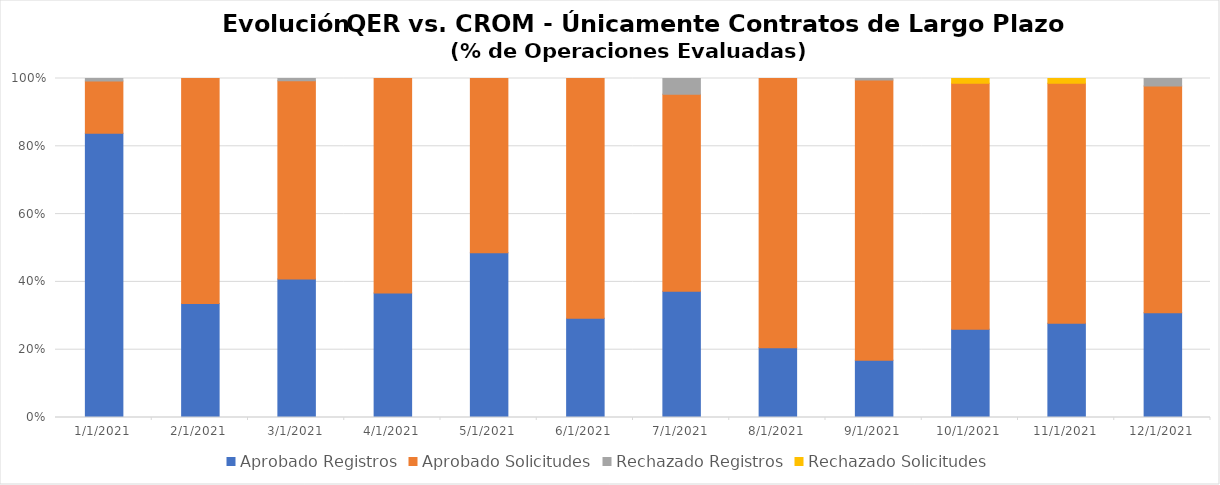
| Category | Aprobado Registros | Aprobado Solicitudes | Rechazado Registros | Rechazado Solicitudes |
|---|---|---|---|---|
| 1/1/21 | 0.838 | 0.154 | 0.008 | 0 |
| 2/1/21 | 0.337 | 0.663 | 0 | 0 |
| 3/1/21 | 0.409 | 0.585 | 0.006 | 0 |
| 4/1/21 | 0.367 | 0.633 | 0 | 0 |
| 5/1/21 | 0.486 | 0.514 | 0 | 0 |
| 6/1/21 | 0.293 | 0.707 | 0 | 0 |
| 7/1/21 | 0.372 | 0.581 | 0.047 | 0 |
| 8/1/21 | 0.206 | 0.794 | 0 | 0 |
| 9/1/21 | 0.169 | 0.827 | 0.004 | 0 |
| 10/1/21 | 0.26 | 0.726 | 0 | 0.014 |
| 11/1/21 | 0.278 | 0.708 | 0 | 0.014 |
| 12/1/21 | 0.309 | 0.669 | 0.022 | 0 |